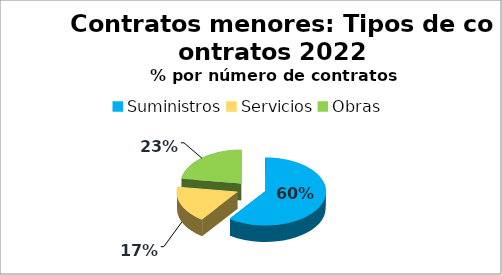
| Category | Series 0 |
|---|---|
| Suministros | 891 |
| Servicios | 259 |
| Obras | 337 |